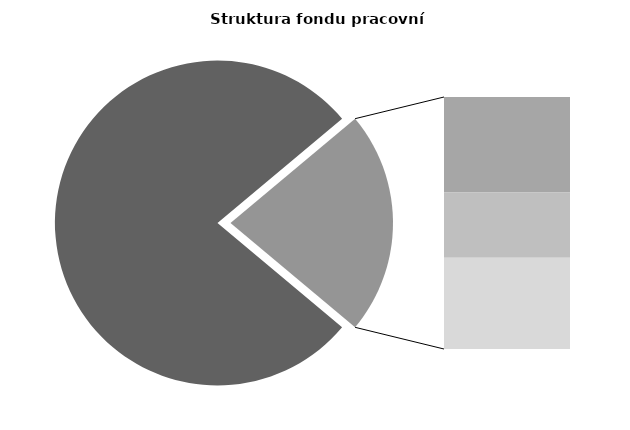
| Category | Series 0 |
|---|---|
| Průměrná měsíční odpracovaná doba bez přesčasu | 132.341 |
| Dovolená | 14.306 |
| Nemoc | 9.748 |
| Jiné | 13.684 |